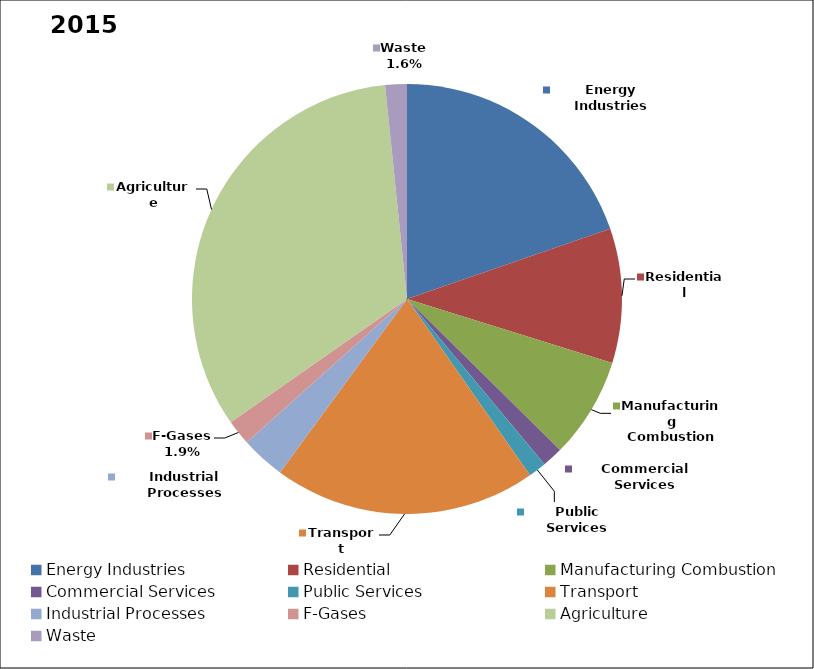
| Category | Series 0 |
|---|---|
| Energy Industries | 11803.218 |
| Residential | 6041.359 |
| Manufacturing Combustion | 4548.821 |
| Commercial Services | 934.768 |
| Public Services | 806.023 |
| Transport | 11827.35 |
| Industrial Processes | 1992.568 |
| F-Gases | 1142.746 |
| Agriculture | 19807.194 |
| Waste | 974.165 |